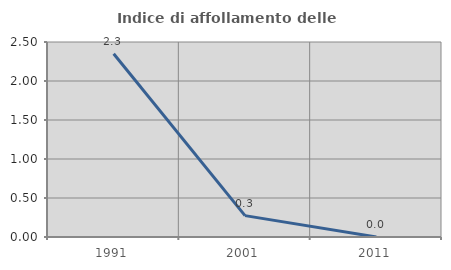
| Category | Indice di affollamento delle abitazioni  |
|---|---|
| 1991.0 | 2.349 |
| 2001.0 | 0.274 |
| 2011.0 | 0 |